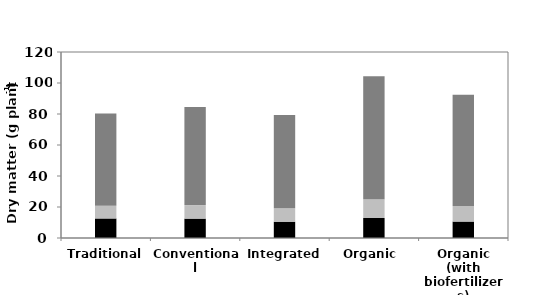
| Category | Tuber  | Stem  | Leaf  |
|---|---|---|---|
| Traditional | 12.6 | 8.14 | 59.6 |
| Conventional | 12.5 | 8.75 | 63.2 |
| Integrated | 10.5 | 8.69 | 60.2 |
| Organic  | 12.9 | 12.14 | 79.3 |
| Organic (with biofertilizers) | 10.6 | 10.04 | 71.8 |